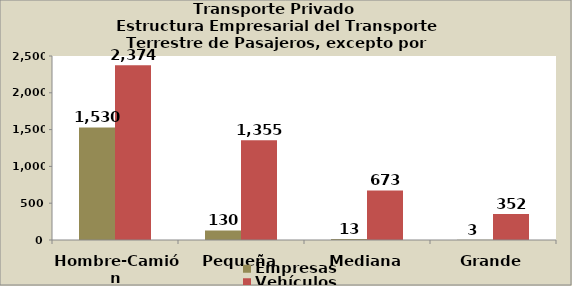
| Category | Empresas | Vehículos |
|---|---|---|
| Hombre-Camión | 1530 | 2374 |
| Pequeña | 130 | 1355 |
| Mediana | 13 | 673 |
| Grande | 3 | 352 |